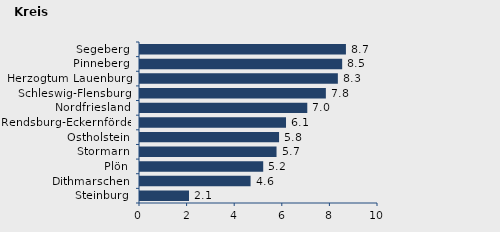
| Category | Wanderungssaldo |
|---|---|
| Steinburg | 2.059 |
| Dithmarschen | 4.646 |
| Plön | 5.177 |
| Stormarn | 5.737 |
| Ostholstein | 5.843 |
| Rendsburg-Eckernförde | 6.135 |
| Nordfriesland | 7.029 |
| Schleswig-Flensburg | 7.809 |
| Herzogtum Lauenburg | 8.313 |
| Pinneberg | 8.495 |
| Segeberg | 8.652 |